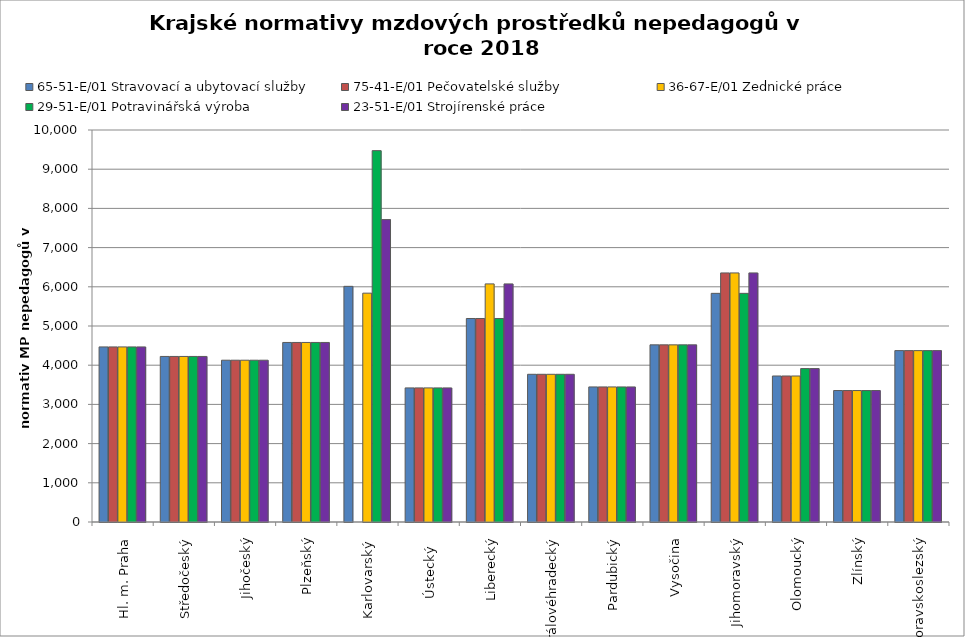
| Category | 65-51-E/01 Stravovací a ubytovací služby | 75-41-E/01 Pečovatelské služby | 36-67-E/01 Zednické práce | 29-51-E/01 Potravinářská výroba | 23-51-E/01 Strojírenské práce |
|---|---|---|---|---|---|
| Hl. m. Praha | 4466.667 | 4466.667 | 4466.667 | 4466.667 | 4466.667 |
| Středočeský | 4223.419 | 4223.419 | 4223.419 | 4223.419 | 4223.419 |
| Jihočeský | 4127.424 | 4127.424 | 4127.424 | 4127.424 | 4127.424 |
| Plzeňský | 4580.191 | 4580.191 | 4580.191 | 4580.191 | 4580.191 |
| Karlovarský  | 6011.689 | 0 | 5837.838 | 9473.684 | 7714.286 |
| Ústecký   | 3420.772 | 3420.772 | 3420.772 | 3420.772 | 3420.772 |
| Liberecký | 5191.705 | 5191.705 | 6073.902 | 5191.705 | 6073.902 |
| Královéhradecký | 3767.96 | 3767.96 | 3767.96 | 3767.96 | 3767.96 |
| Pardubický | 3445.644 | 3445.644 | 3445.644 | 3445.644 | 3445.644 |
| Vysočina | 4519.133 | 4519.133 | 4519.133 | 4519.133 | 4519.133 |
| Jihomoravský | 5832.848 | 6353.9 | 6353.9 | 5832.848 | 6353.9 |
| Olomoucký | 3724.603 | 3724.603 | 3724.603 | 3913.659 | 3913.659 |
| Zlínský | 3353.568 | 3353.568 | 3353.568 | 3353.568 | 3353.568 |
| Moravskoslezský | 4371.904 | 4371.904 | 4371.904 | 4371.904 | 4371.904 |